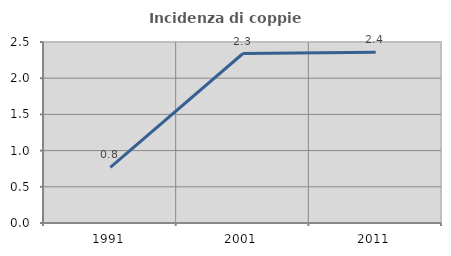
| Category | Incidenza di coppie miste |
|---|---|
| 1991.0 | 0.769 |
| 2001.0 | 2.341 |
| 2011.0 | 2.36 |